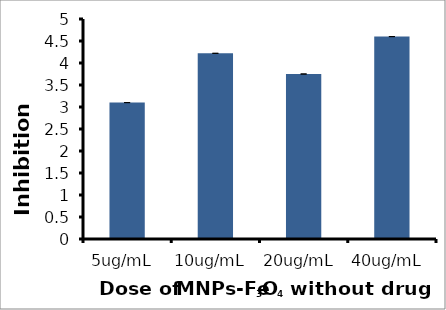
| Category | Series 0 |
|---|---|
| 5ug/mL  | 3.1 |
| 10ug/mL  | 4.22 |
| 20ug/mL  | 3.75 |
| 40ug/mL  | 4.6 |